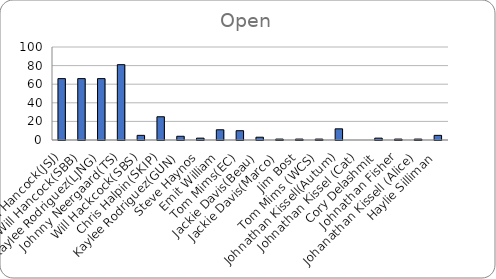
| Category | Total |
|---|---|
| Will Hancock(JSJ) | 66 |
| Will Hancock(SBB) | 66 |
| Kaylee Rodriguez(LJNG) | 66 |
| Johnny Neergaard(TS) | 81 |
| Will Hackcock(SBS) | 5 |
| Chris Halpin(SKIP) | 25 |
| Kaylee Rodriguez(GUN) | 4 |
| Steve Haynos | 2 |
| Emit William | 11 |
| Tom Mims(EC) | 10 |
| Jackie Davis(Beau) | 3 |
| Jackie Davis(Marco) | 1 |
| Jim Bost | 1 |
| Tom Mims (WCS) | 1 |
| Johnathan Kissell(Autum) | 12 |
| Johnathan Kissel (Cat) | 0 |
| Cory Delashmit | 2 |
| Johnathan Fisher | 1 |
| Johanathan Kissell (Alice) | 1 |
| Haylie Silliman | 5 |